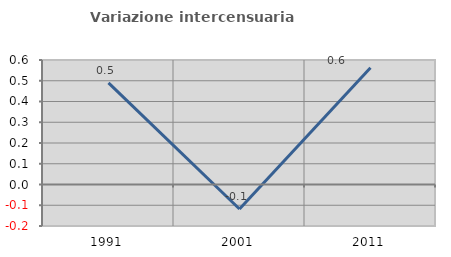
| Category | Variazione intercensuaria annua |
|---|---|
| 1991.0 | 0.49 |
| 2001.0 | -0.118 |
| 2011.0 | 0.563 |